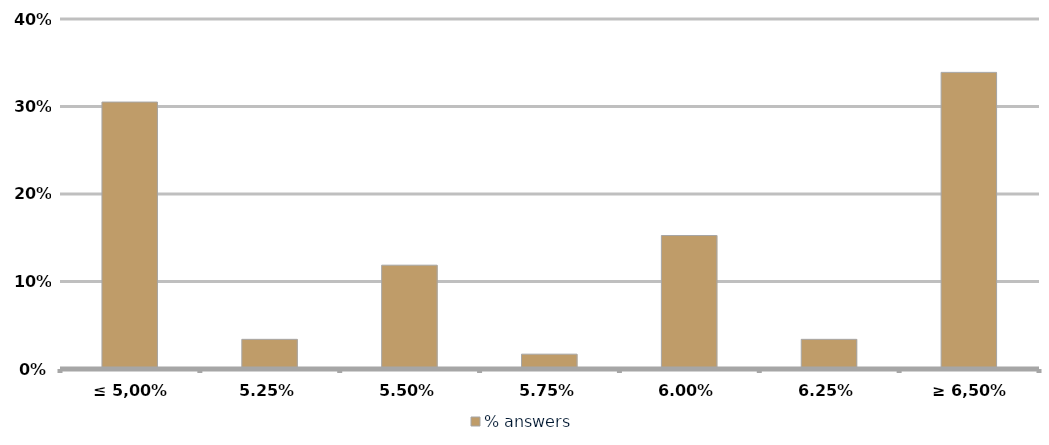
| Category | % answers |
|---|---|
| ≤ 5,00% | 0.305 |
| 5,25% | 0.034 |
| 5,50% | 0.119 |
| 5,75% | 0.017 |
| 6,00% | 0.153 |
| 6,25% | 0.034 |
| ≥ 6,50% | 0.339 |